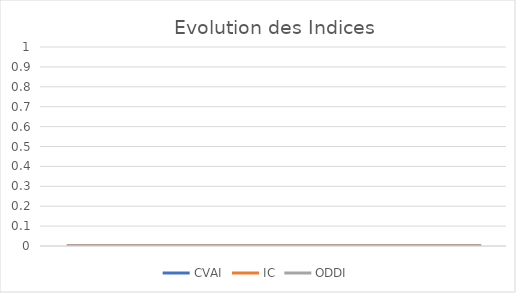
| Category | CVAI | IC | ODDI |
|---|---|---|---|
|  | 0 | 0 | 0 |
|  | 0 | 0 | 0 |
|  | 0 | 0 | 0 |
|  | 0 | 0 | 0 |
|  | 0 | 0 | 0 |
|  | 0 | 0 | 0 |
|  | 0 | 0 | 0 |
|  | 0 | 0 | 0 |
|  | 0 | 0 | 0 |